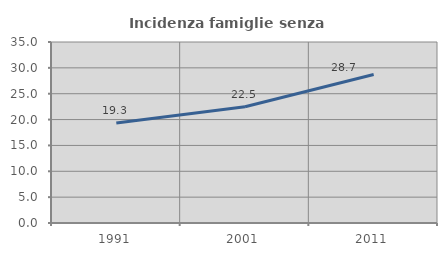
| Category | Incidenza famiglie senza nuclei |
|---|---|
| 1991.0 | 19.321 |
| 2001.0 | 22.492 |
| 2011.0 | 28.704 |